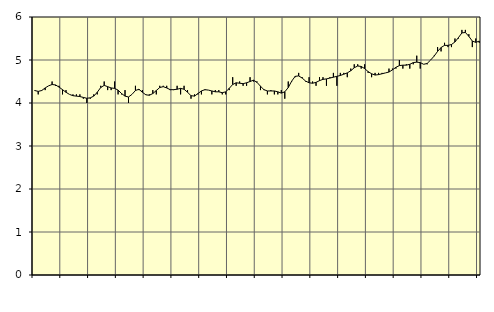
| Category | Piggar | Personliga och kulturella tjänster, SNI 90-98 |
|---|---|---|
| nan | 4.3 | 4.29 |
| 87.0 | 4.2 | 4.27 |
| 87.0 | 4.3 | 4.29 |
| 87.0 | 4.3 | 4.35 |
| nan | 4.4 | 4.4 |
| 88.0 | 4.5 | 4.43 |
| 88.0 | 4.4 | 4.42 |
| 88.0 | 4.4 | 4.37 |
| nan | 4.2 | 4.31 |
| 89.0 | 4.3 | 4.25 |
| 89.0 | 4.2 | 4.2 |
| 89.0 | 4.2 | 4.17 |
| nan | 4.2 | 4.16 |
| 90.0 | 4.2 | 4.15 |
| 90.0 | 4.1 | 4.13 |
| 90.0 | 4 | 4.11 |
| nan | 4.1 | 4.12 |
| 91.0 | 4.2 | 4.16 |
| 91.0 | 4.2 | 4.25 |
| 91.0 | 4.4 | 4.36 |
| nan | 4.5 | 4.41 |
| 92.0 | 4.3 | 4.38 |
| 92.0 | 4.3 | 4.35 |
| 92.0 | 4.5 | 4.34 |
| nan | 4.2 | 4.3 |
| 93.0 | 4.2 | 4.22 |
| 93.0 | 4.3 | 4.16 |
| 93.0 | 4 | 4.14 |
| nan | 4.2 | 4.2 |
| 94.0 | 4.4 | 4.29 |
| 94.0 | 4.3 | 4.32 |
| 94.0 | 4.3 | 4.25 |
| nan | 4.2 | 4.19 |
| 95.0 | 4.2 | 4.18 |
| 95.0 | 4.3 | 4.22 |
| 95.0 | 4.2 | 4.29 |
| nan | 4.4 | 4.36 |
| 96.0 | 4.4 | 4.38 |
| 96.0 | 4.4 | 4.35 |
| 96.0 | 4.3 | 4.31 |
| nan | 4.3 | 4.31 |
| 97.0 | 4.4 | 4.32 |
| 97.0 | 4.2 | 4.34 |
| 97.0 | 4.4 | 4.32 |
| nan | 4.3 | 4.25 |
| 98.0 | 4.1 | 4.17 |
| 98.0 | 4.2 | 4.16 |
| 98.0 | 4.2 | 4.22 |
| nan | 4.2 | 4.28 |
| 99.0 | 4.3 | 4.31 |
| 99.0 | 4.3 | 4.3 |
| 99.0 | 4.2 | 4.28 |
| nan | 4.3 | 4.26 |
| 0.0 | 4.3 | 4.26 |
| 0.0 | 4.2 | 4.24 |
| 0.0 | 4.2 | 4.26 |
| nan | 4.3 | 4.34 |
| 1.0 | 4.6 | 4.43 |
| 1.0 | 4.4 | 4.47 |
| 1.0 | 4.5 | 4.46 |
| nan | 4.4 | 4.45 |
| 2.0 | 4.4 | 4.47 |
| 2.0 | 4.6 | 4.5 |
| 2.0 | 4.5 | 4.53 |
| nan | 4.5 | 4.48 |
| 3.0 | 4.3 | 4.39 |
| 3.0 | 4.3 | 4.31 |
| 3.0 | 4.2 | 4.28 |
| nan | 4.3 | 4.28 |
| 4.0 | 4.2 | 4.28 |
| 4.0 | 4.2 | 4.26 |
| 4.0 | 4.3 | 4.23 |
| nan | 4.1 | 4.26 |
| 5.0 | 4.5 | 4.36 |
| 5.0 | 4.5 | 4.51 |
| 5.0 | 4.6 | 4.62 |
| nan | 4.7 | 4.63 |
| 6.0 | 4.6 | 4.58 |
| 6.0 | 4.5 | 4.51 |
| 6.0 | 4.6 | 4.47 |
| nan | 4.5 | 4.46 |
| 7.0 | 4.4 | 4.48 |
| 7.0 | 4.6 | 4.52 |
| 7.0 | 4.6 | 4.55 |
| nan | 4.4 | 4.56 |
| 8.0 | 4.6 | 4.58 |
| 8.0 | 4.7 | 4.6 |
| 8.0 | 4.4 | 4.62 |
| nan | 4.7 | 4.64 |
| 9.0 | 4.7 | 4.67 |
| 9.0 | 4.6 | 4.7 |
| 9.0 | 4.8 | 4.75 |
| nan | 4.9 | 4.82 |
| 10.0 | 4.9 | 4.86 |
| 10.0 | 4.8 | 4.85 |
| 10.0 | 4.9 | 4.8 |
| nan | 4.7 | 4.73 |
| 11.0 | 4.6 | 4.68 |
| 11.0 | 4.7 | 4.65 |
| 11.0 | 4.7 | 4.66 |
| nan | 4.7 | 4.68 |
| 12.0 | 4.7 | 4.7 |
| 12.0 | 4.8 | 4.72 |
| 12.0 | 4.8 | 4.77 |
| nan | 4.8 | 4.83 |
| 13.0 | 5 | 4.87 |
| 13.0 | 4.8 | 4.88 |
| 13.0 | 4.9 | 4.88 |
| nan | 4.8 | 4.9 |
| 14.0 | 4.9 | 4.94 |
| 14.0 | 5.1 | 4.95 |
| 14.0 | 4.8 | 4.94 |
| nan | 4.9 | 4.9 |
| 15.0 | 4.9 | 4.92 |
| 15.0 | 5 | 5 |
| 15.0 | 5.1 | 5.09 |
| nan | 5.3 | 5.2 |
| 16.0 | 5.2 | 5.29 |
| 16.0 | 5.4 | 5.34 |
| 16.0 | 5.3 | 5.34 |
| nan | 5.3 | 5.36 |
| 17.0 | 5.5 | 5.42 |
| 17.0 | 5.5 | 5.52 |
| 17.0 | 5.7 | 5.63 |
| nan | 5.7 | 5.64 |
| 18.0 | 5.6 | 5.55 |
| 18.0 | 5.3 | 5.44 |
| 18.0 | 5.5 | 5.41 |
| nan | 5.4 | 5.44 |